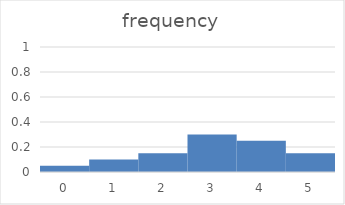
| Category | frequency |
|---|---|
| 0.0 | 0.05 |
| 1.0 | 0.1 |
| 2.0 | 0.15 |
| 3.0 | 0.3 |
| 4.0 | 0.25 |
| 5.0 | 0.15 |